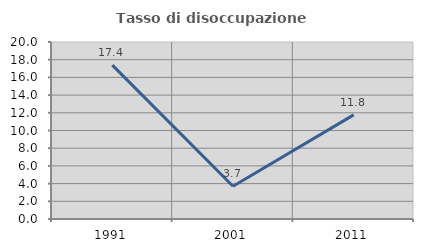
| Category | Tasso di disoccupazione giovanile  |
|---|---|
| 1991.0 | 17.391 |
| 2001.0 | 3.704 |
| 2011.0 | 11.765 |